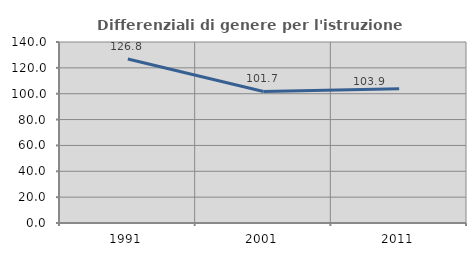
| Category | Differenziali di genere per l'istruzione superiore |
|---|---|
| 1991.0 | 126.82 |
| 2001.0 | 101.729 |
| 2011.0 | 103.933 |